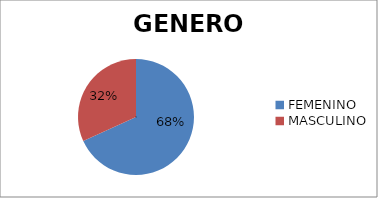
| Category | Series 0 |
|---|---|
| FEMENINO | 15 |
| MASCULINO | 7 |